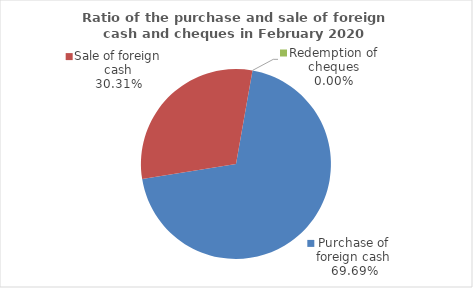
| Category | Series 0 |
|---|---|
| Purchase of foreign cash | 69.693 |
| Sale of foreign cash | 30.307 |
| Redemption of cheques | 0 |